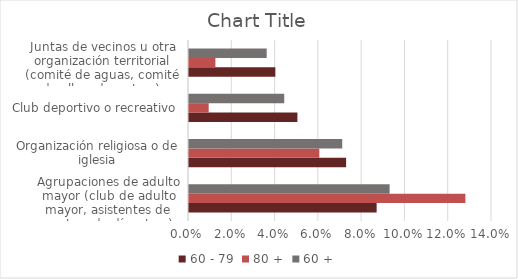
| Category | 60 - 79 | 80 + | 60 + |
|---|---|---|---|
| Agrupaciones de adulto mayor (club de adulto mayor, asistentes de centros de día, otros) | 0.087 | 0.128 | 0.093 |
| Organización religiosa o de iglesia | 0.073 | 0.06 | 0.071 |
| Club deportivo o recreativo | 0.05 | 0.009 | 0.044 |
| Juntas de vecinos u otra organización territorial (comité de aguas, comité de allegados, otros) | 0.04 | 0.012 | 0.036 |